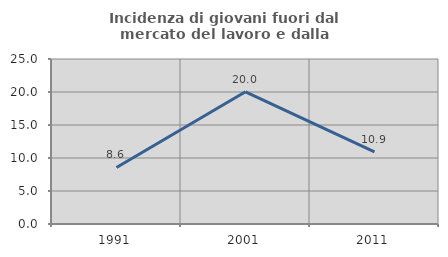
| Category | Incidenza di giovani fuori dal mercato del lavoro e dalla formazione  |
|---|---|
| 1991.0 | 8.568 |
| 2001.0 | 20.029 |
| 2011.0 | 10.94 |